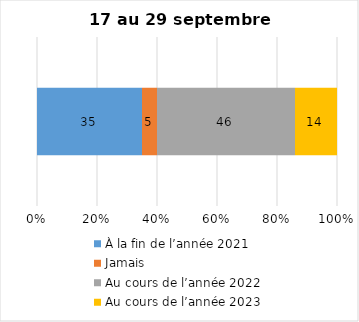
| Category | À la fin de l’année 2021 | Jamais | Au cours de l’année 2022 | Au cours de l’année 2023 |
|---|---|---|---|---|
| 0 | 35 | 5 | 46 | 14 |